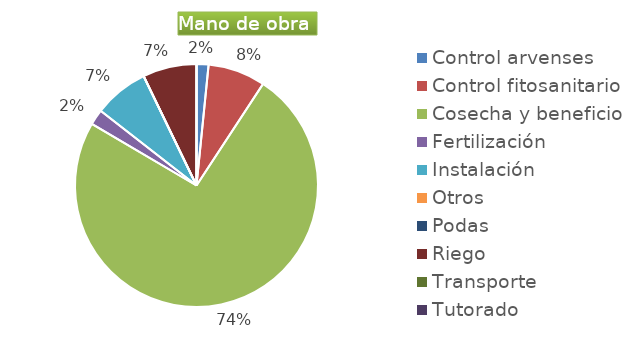
| Category | Series 0 |
|---|---|
| Control arvenses | 500000 |
| Control fitosanitario | 2400000 |
| Cosecha y beneficio | 23315040 |
| Fertilización | 650000 |
| Instalación | 2293464 |
| Otros | 0 |
| Podas | 0 |
| Riego | 2250000 |
| Transporte | 0 |
| Tutorado | 0 |